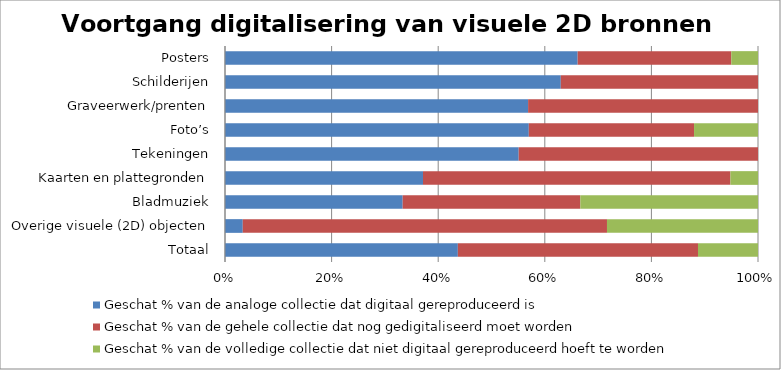
| Category | Geschat % van de analoge collectie dat digitaal gereproduceerd is  | Geschat % van de gehele collectie dat nog gedigitaliseerd moet worden | Geschat % van de volledige collectie dat niet digitaal gereproduceerd hoeft te worden |
|---|---|---|---|
| Totaal | 38.243 | 39.441 | 9.856 |
| Overige visuele (2D) objecten | 3.333 | 68.333 | 28.333 |
| Bladmuziek | 33.333 | 33.333 | 33.333 |
| Kaarten en plattegronden | 37.182 | 57.727 | 5.182 |
| Tekeningen | 55.231 | 45 | 0 |
| Foto’s | 57 | 31 | 12 |
| Graveerwerk/prenten | 56.867 | 43.133 | 0 |
| Schilderijen | 63 | 37 | 0 |
| Posters | 66 | 28.75 | 5 |